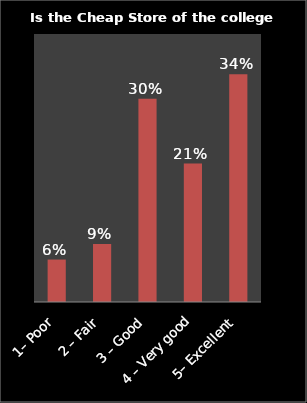
| Category | Series 0 |
|---|---|
| 1– Poor | 0.063 |
| 2 – Fair | 0.087 |
| 3 – Good | 0.303 |
| 4 – Very good | 0.207 |
| 5– Excellent | 0.34 |